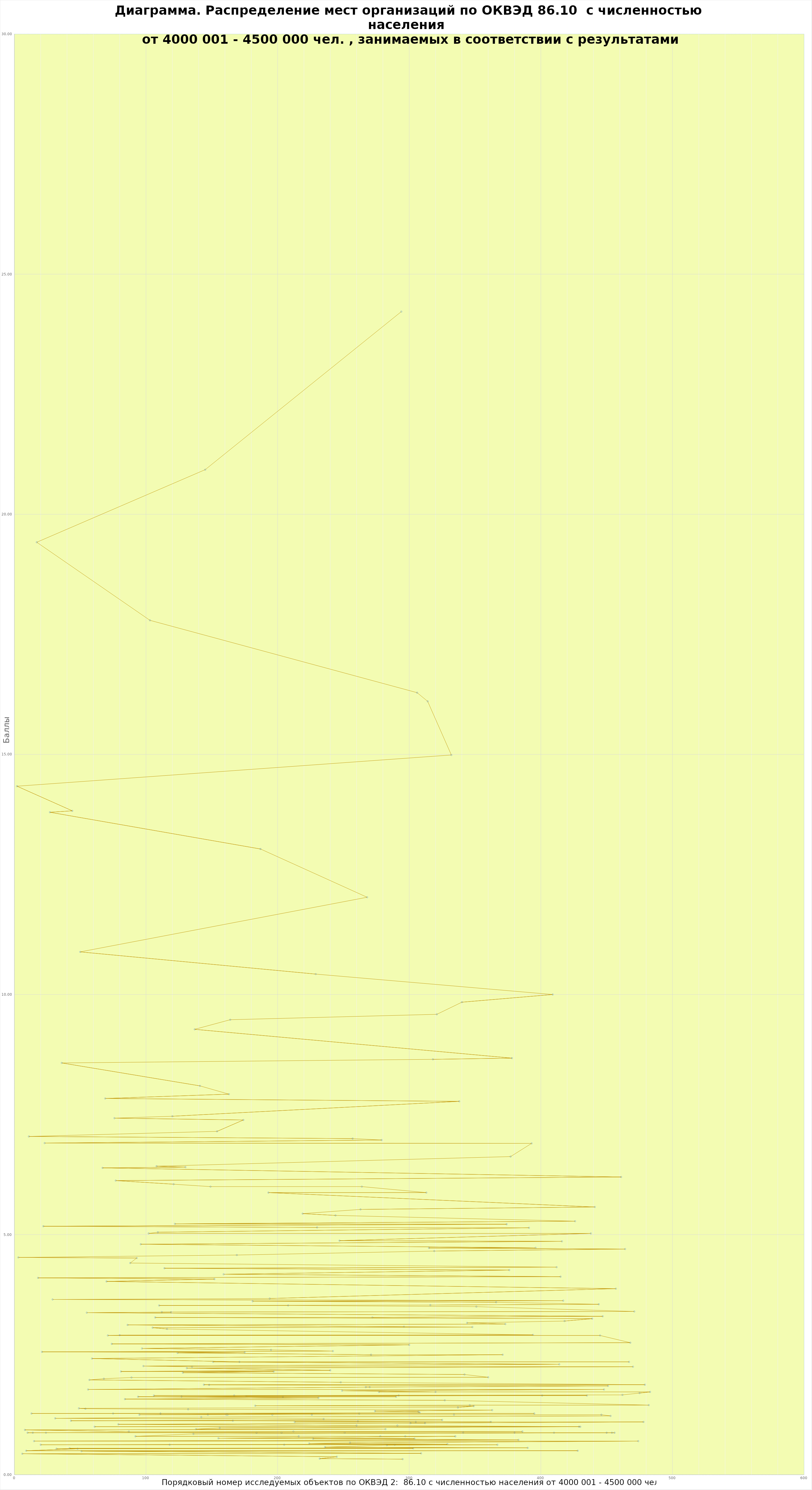
| Category | Баллы |
|---|---|
| 294.0 | 24.22 |
| 145.0 | 20.929 |
| 17.0 | 19.417 |
| 103.0 | 17.792 |
| 306.0 | 16.285 |
| 314.0 | 16.105 |
| 332.0 | 14.988 |
| 2.0 | 14.338 |
| 44.0 | 13.825 |
| 27.0 | 13.795 |
| 187.0 | 13.03 |
| 268.0 | 12.025 |
| 50.0 | 10.888 |
| 229.0 | 10.425 |
| 409.0 | 10 |
| 340.0 | 9.84 |
| 321.0 | 9.587 |
| 164.0 | 9.475 |
| 137.0 | 9.275 |
| 378.0 | 8.675 |
| 318.0 | 8.65 |
| 36.0 | 8.575 |
| 141.0 | 8.098 |
| 163.0 | 7.925 |
| 69.0 | 7.835 |
| 338.0 | 7.775 |
| 120.0 | 7.465 |
| 76.0 | 7.425 |
| 174.0 | 7.388 |
| 154.0 | 7.15 |
| 11.0 | 7.044 |
| 257.0 | 7 |
| 279.0 | 6.97 |
| 23.0 | 6.906 |
| 393.0 | 6.9 |
| 377.0 | 6.625 |
| 108.0 | 6.425 |
| 130.0 | 6.406 |
| 67.0 | 6.39 |
| 461.0 | 6.2 |
| 77.0 | 6.125 |
| 121.0 | 6.05 |
| 149.0 | 6 |
| 264.0 | 6 |
| 313.0 | 5.875 |
| 193.0 | 5.875 |
| 441.0 | 5.575 |
| 263.0 | 5.525 |
| 219.0 | 5.438 |
| 244.0 | 5.4 |
| 426.0 | 5.28 |
| 122.0 | 5.225 |
| 374.0 | 5.217 |
| 22.0 | 5.175 |
| 230.0 | 5.15 |
| 391.0 | 5.142 |
| 109.0 | 5.05 |
| 102.0 | 5.025 |
| 438.0 | 5.025 |
| 247.0 | 4.875 |
| 416.0 | 4.86 |
| 96.0 | 4.8 |
| 396.0 | 4.725 |
| 315.0 | 4.722 |
| 464.0 | 4.7 |
| 319.0 | 4.658 |
| 169.0 | 4.575 |
| 3.0 | 4.525 |
| 93.0 | 4.512 |
| 88.0 | 4.408 |
| 412.0 | 4.322 |
| 114.0 | 4.3 |
| 376.0 | 4.262 |
| 159.0 | 4.175 |
| 415.0 | 4.125 |
| 18.0 | 4.1 |
| 152.0 | 4.075 |
| 70.0 | 4.025 |
| 457.0 | 3.875 |
| 194.0 | 3.67 |
| 29.0 | 3.65 |
| 417.0 | 3.625 |
| 181.0 | 3.613 |
| 366.0 | 3.592 |
| 444.0 | 3.55 |
| 316.0 | 3.533 |
| 110.0 | 3.525 |
| 208.0 | 3.525 |
| 351.0 | 3.5 |
| 471.0 | 3.4 |
| 112.0 | 3.388 |
| 119.0 | 3.385 |
| 55.0 | 3.375 |
| 447.0 | 3.3 |
| 272.0 | 3.275 |
| 107.0 | 3.275 |
| 439.0 | 3.25 |
| 418.0 | 3.2 |
| 344.0 | 3.162 |
| 373.0 | 3.138 |
| 86.0 | 3.12 |
| 296.0 | 3.082 |
| 348.0 | 3.075 |
| 105.0 | 3.062 |
| 116.0 | 3.035 |
| 394.0 | 2.912 |
| 80.0 | 2.907 |
| 71.0 | 2.9 |
| 445.0 | 2.9 |
| 468.0 | 2.75 |
| 74.0 | 2.725 |
| 300.0 | 2.705 |
| 97.0 | 2.63 |
| 195.0 | 2.6 |
| 242.0 | 2.575 |
| 21.0 | 2.558 |
| 175.0 | 2.55 |
| 124.0 | 2.538 |
| 271.0 | 2.5 |
| 371.0 | 2.5 |
| 59.0 | 2.42 |
| 171.0 | 2.35 |
| 467.0 | 2.35 |
| 151.0 | 2.35 |
| 414.0 | 2.3 |
| 98.0 | 2.263 |
| 135.0 | 2.25 |
| 470.0 | 2.25 |
| 131.0 | 2.22 |
| 240.0 | 2.175 |
| 81.0 | 2.15 |
| 197.0 | 2.15 |
| 128.0 | 2.125 |
| 342.0 | 2.088 |
| 360.0 | 2.03 |
| 89.0 | 2.025 |
| 68.0 | 2 |
| 57.0 | 1.975 |
| 248.0 | 1.925 |
| 479.0 | 1.875 |
| 144.0 | 1.875 |
| 148.0 | 1.871 |
| 451.0 | 1.85 |
| 267.0 | 1.825 |
| 270.0 | 1.825 |
| 56.0 | 1.775 |
| 448.0 | 1.775 |
| 249.0 | 1.75 |
| 320.0 | 1.725 |
| 277.0 | 1.725 |
| 483.0 | 1.725 |
| 475.0 | 1.7 |
| 462.0 | 1.662 |
| 167.0 | 1.65 |
| 106.0 | 1.65 |
| 292.0 | 1.65 |
| 401.0 | 1.65 |
| 435.0 | 1.65 |
| 176.0 | 1.638 |
| 127.0 | 1.625 |
| 204.0 | 1.625 |
| 290.0 | 1.625 |
| 94.0 | 1.625 |
| 231.0 | 1.6 |
| 84.0 | 1.575 |
| 327.0 | 1.55 |
| 482.0 | 1.45 |
| 346.0 | 1.45 |
| 183.0 | 1.438 |
| 349.0 | 1.429 |
| 337.0 | 1.4 |
| 49.0 | 1.383 |
| 54.0 | 1.375 |
| 132.0 | 1.362 |
| 363.0 | 1.346 |
| 274.0 | 1.325 |
| 307.0 | 1.312 |
| 308.0 | 1.292 |
| 75.0 | 1.275 |
| 395.0 | 1.275 |
| 13.0 | 1.275 |
| 111.0 | 1.275 |
| 262.0 | 1.275 |
| 95.0 | 1.25 |
| 147.0 | 1.25 |
| 161.0 | 1.25 |
| 162.0 | 1.25 |
| 196.0 | 1.25 |
| 226.0 | 1.25 |
| 334.0 | 1.25 |
| 446.0 | 1.25 |
| 453.0 | 1.225 |
| 142.0 | 1.2 |
| 31.0 | 1.175 |
| 235.0 | 1.16 |
| 325.0 | 1.142 |
| 43.0 | 1.125 |
| 166.0 | 1.125 |
| 261.0 | 1.108 |
| 362.0 | 1.1 |
| 213.0 | 1.1 |
| 305.0 | 1.1 |
| 478.0 | 1.1 |
| 301.0 | 1.075 |
| 312.0 | 1.075 |
| 79.0 | 1.05 |
| 260.0 | 1.025 |
| 291.0 | 1.025 |
| 429.0 | 1 |
| 61.0 | 1 |
| 430.0 | 1 |
| 156.0 | 0.975 |
| 138.0 | 0.95 |
| 282.0 | 0.95 |
| 8.0 | 0.933 |
| 87.0 | 0.9 |
| 212.0 | 0.9 |
| 386.0 | 0.9 |
| 10.0 | 0.875 |
| 14.0 | 0.875 |
| 24.0 | 0.875 |
| 184.0 | 0.875 |
| 203.0 | 0.875 |
| 251.0 | 0.875 |
| 341.0 | 0.875 |
| 380.0 | 0.875 |
| 410.0 | 0.875 |
| 450.0 | 0.875 |
| 454.0 | 0.875 |
| 456.0 | 0.875 |
| 136.0 | 0.85 |
| 92.0 | 0.8 |
| 216.0 | 0.8 |
| 278.0 | 0.8 |
| 297.0 | 0.8 |
| 335.0 | 0.8 |
| 155.0 | 0.76 |
| 304.0 | 0.75 |
| 227.0 | 0.75 |
| 383.0 | 0.725 |
| 15.0 | 0.7 |
| 474.0 | 0.7 |
| 255.0 | 0.667 |
| 224.0 | 0.65 |
| 329.0 | 0.638 |
| 20.0 | 0.625 |
| 118.0 | 0.625 |
| 205.0 | 0.625 |
| 289.0 | 0.625 |
| 367.0 | 0.625 |
| 283.0 | 0.617 |
| 236.0 | 0.575 |
| 390.0 | 0.56 |
| 42.0 | 0.55 |
| 303.0 | 0.55 |
| 32.0 | 0.542 |
| 48.0 | 0.542 |
| 9.0 | 0.5 |
| 428.0 | 0.5 |
| 51.0 | 0.492 |
| 309.0 | 0.445 |
| 6.0 | 0.438 |
| 245.0 | 0.375 |
| 232.0 | 0.335 |
| 295.0 | 0.325 |